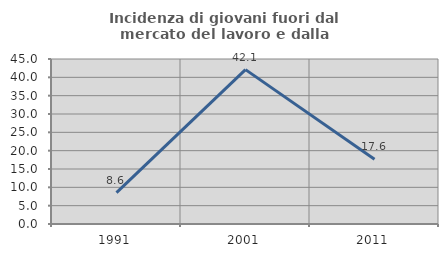
| Category | Incidenza di giovani fuori dal mercato del lavoro e dalla formazione  |
|---|---|
| 1991.0 | 8.571 |
| 2001.0 | 42.105 |
| 2011.0 | 17.647 |